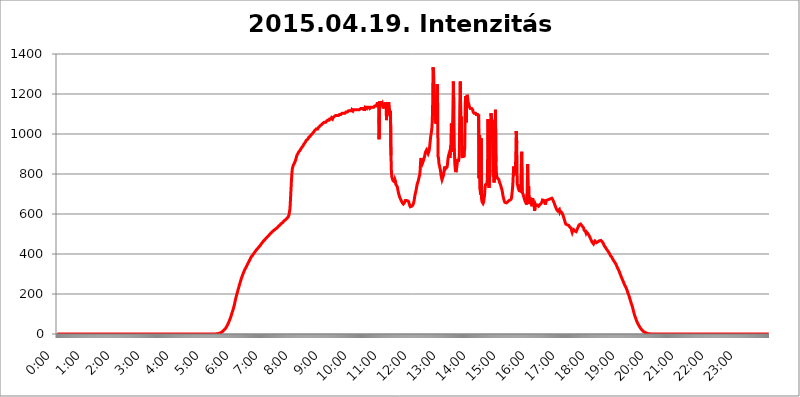
| Category | 2015.04.19. Intenzitás [W/m^2] |
|---|---|
| 0.0 | -0.256 |
| 0.0006944444444444445 | -0.256 |
| 0.001388888888888889 | -0.256 |
| 0.0020833333333333333 | -0.256 |
| 0.002777777777777778 | -0.256 |
| 0.003472222222222222 | -0.256 |
| 0.004166666666666667 | -0.256 |
| 0.004861111111111111 | -0.256 |
| 0.005555555555555556 | -0.256 |
| 0.0062499999999999995 | -0.256 |
| 0.006944444444444444 | -0.256 |
| 0.007638888888888889 | -0.256 |
| 0.008333333333333333 | -0.256 |
| 0.009027777777777779 | -0.256 |
| 0.009722222222222222 | -0.256 |
| 0.010416666666666666 | -0.256 |
| 0.011111111111111112 | -0.256 |
| 0.011805555555555555 | -0.256 |
| 0.012499999999999999 | -0.256 |
| 0.013194444444444444 | -0.256 |
| 0.013888888888888888 | -0.256 |
| 0.014583333333333332 | -0.256 |
| 0.015277777777777777 | -0.256 |
| 0.015972222222222224 | -0.256 |
| 0.016666666666666666 | -0.256 |
| 0.017361111111111112 | -0.256 |
| 0.018055555555555557 | -0.256 |
| 0.01875 | -0.256 |
| 0.019444444444444445 | -0.256 |
| 0.02013888888888889 | -0.256 |
| 0.020833333333333332 | -0.256 |
| 0.02152777777777778 | -0.256 |
| 0.022222222222222223 | -0.256 |
| 0.02291666666666667 | -0.256 |
| 0.02361111111111111 | -0.256 |
| 0.024305555555555556 | -0.256 |
| 0.024999999999999998 | -0.256 |
| 0.025694444444444447 | -0.256 |
| 0.02638888888888889 | -0.256 |
| 0.027083333333333334 | -0.256 |
| 0.027777777777777776 | -0.256 |
| 0.02847222222222222 | -0.256 |
| 0.029166666666666664 | -0.256 |
| 0.029861111111111113 | -0.256 |
| 0.030555555555555555 | -0.256 |
| 0.03125 | -0.256 |
| 0.03194444444444445 | -0.256 |
| 0.03263888888888889 | -0.256 |
| 0.03333333333333333 | -0.256 |
| 0.034027777777777775 | -0.256 |
| 0.034722222222222224 | -0.256 |
| 0.035416666666666666 | -0.256 |
| 0.036111111111111115 | -0.256 |
| 0.03680555555555556 | -0.256 |
| 0.0375 | -0.256 |
| 0.03819444444444444 | -0.256 |
| 0.03888888888888889 | -0.256 |
| 0.03958333333333333 | -0.256 |
| 0.04027777777777778 | -0.256 |
| 0.04097222222222222 | -0.256 |
| 0.041666666666666664 | -0.256 |
| 0.042361111111111106 | -0.256 |
| 0.04305555555555556 | -0.256 |
| 0.043750000000000004 | -0.256 |
| 0.044444444444444446 | -0.256 |
| 0.04513888888888889 | -0.256 |
| 0.04583333333333334 | -0.256 |
| 0.04652777777777778 | -0.256 |
| 0.04722222222222222 | -0.256 |
| 0.04791666666666666 | -0.256 |
| 0.04861111111111111 | -0.256 |
| 0.049305555555555554 | -0.256 |
| 0.049999999999999996 | -0.256 |
| 0.05069444444444445 | -0.256 |
| 0.051388888888888894 | -0.256 |
| 0.052083333333333336 | -0.256 |
| 0.05277777777777778 | -0.256 |
| 0.05347222222222222 | -0.256 |
| 0.05416666666666667 | -0.256 |
| 0.05486111111111111 | -0.256 |
| 0.05555555555555555 | -0.256 |
| 0.05625 | -0.256 |
| 0.05694444444444444 | -0.256 |
| 0.057638888888888885 | -0.256 |
| 0.05833333333333333 | -0.256 |
| 0.05902777777777778 | -0.256 |
| 0.059722222222222225 | -0.256 |
| 0.06041666666666667 | -0.256 |
| 0.061111111111111116 | -0.256 |
| 0.06180555555555556 | -0.256 |
| 0.0625 | -0.256 |
| 0.06319444444444444 | -0.256 |
| 0.06388888888888888 | -0.256 |
| 0.06458333333333334 | -0.256 |
| 0.06527777777777778 | -0.256 |
| 0.06597222222222222 | -0.256 |
| 0.06666666666666667 | -0.256 |
| 0.06736111111111111 | -0.256 |
| 0.06805555555555555 | -0.256 |
| 0.06874999999999999 | -0.256 |
| 0.06944444444444443 | -0.256 |
| 0.07013888888888889 | -0.256 |
| 0.07083333333333333 | -0.256 |
| 0.07152777777777779 | -0.256 |
| 0.07222222222222223 | -0.256 |
| 0.07291666666666667 | -0.256 |
| 0.07361111111111111 | -0.256 |
| 0.07430555555555556 | -0.256 |
| 0.075 | -0.256 |
| 0.07569444444444444 | -0.256 |
| 0.0763888888888889 | -0.256 |
| 0.07708333333333334 | -0.256 |
| 0.07777777777777778 | -0.256 |
| 0.07847222222222222 | -0.256 |
| 0.07916666666666666 | -0.256 |
| 0.0798611111111111 | -0.256 |
| 0.08055555555555556 | -0.256 |
| 0.08125 | -0.256 |
| 0.08194444444444444 | -0.256 |
| 0.08263888888888889 | -0.256 |
| 0.08333333333333333 | -0.256 |
| 0.08402777777777777 | -0.256 |
| 0.08472222222222221 | -0.256 |
| 0.08541666666666665 | -0.256 |
| 0.08611111111111112 | -0.256 |
| 0.08680555555555557 | -0.256 |
| 0.08750000000000001 | -0.256 |
| 0.08819444444444445 | -0.256 |
| 0.08888888888888889 | -0.256 |
| 0.08958333333333333 | -0.256 |
| 0.09027777777777778 | -0.256 |
| 0.09097222222222222 | -0.256 |
| 0.09166666666666667 | -0.256 |
| 0.09236111111111112 | -0.256 |
| 0.09305555555555556 | -0.256 |
| 0.09375 | -0.256 |
| 0.09444444444444444 | -0.256 |
| 0.09513888888888888 | -0.256 |
| 0.09583333333333333 | -0.256 |
| 0.09652777777777777 | -0.256 |
| 0.09722222222222222 | -0.256 |
| 0.09791666666666667 | -0.256 |
| 0.09861111111111111 | -0.256 |
| 0.09930555555555555 | -0.256 |
| 0.09999999999999999 | -0.256 |
| 0.10069444444444443 | -0.256 |
| 0.1013888888888889 | -0.256 |
| 0.10208333333333335 | -0.256 |
| 0.10277777777777779 | -0.256 |
| 0.10347222222222223 | -0.256 |
| 0.10416666666666667 | -0.256 |
| 0.10486111111111111 | -0.256 |
| 0.10555555555555556 | -0.256 |
| 0.10625 | -0.256 |
| 0.10694444444444444 | -0.256 |
| 0.1076388888888889 | -0.256 |
| 0.10833333333333334 | -0.256 |
| 0.10902777777777778 | -0.256 |
| 0.10972222222222222 | -0.256 |
| 0.1111111111111111 | -0.256 |
| 0.11180555555555556 | -0.256 |
| 0.11180555555555556 | -0.256 |
| 0.1125 | -0.256 |
| 0.11319444444444444 | -0.256 |
| 0.11388888888888889 | -0.256 |
| 0.11458333333333333 | -0.256 |
| 0.11527777777777777 | -0.256 |
| 0.11597222222222221 | -0.256 |
| 0.11666666666666665 | -0.256 |
| 0.1173611111111111 | -0.256 |
| 0.11805555555555557 | -0.256 |
| 0.11944444444444445 | -0.256 |
| 0.12013888888888889 | -0.256 |
| 0.12083333333333333 | -0.256 |
| 0.12152777777777778 | -0.256 |
| 0.12222222222222223 | -0.256 |
| 0.12291666666666667 | -0.256 |
| 0.12291666666666667 | -0.256 |
| 0.12361111111111112 | -0.256 |
| 0.12430555555555556 | -0.256 |
| 0.125 | -0.256 |
| 0.12569444444444444 | -0.256 |
| 0.12638888888888888 | -0.256 |
| 0.12708333333333333 | -0.256 |
| 0.16875 | -0.256 |
| 0.12847222222222224 | -0.256 |
| 0.12916666666666668 | -0.256 |
| 0.12986111111111112 | -0.256 |
| 0.13055555555555556 | -0.256 |
| 0.13125 | -0.256 |
| 0.13194444444444445 | -0.256 |
| 0.1326388888888889 | -0.256 |
| 0.13333333333333333 | -0.256 |
| 0.13402777777777777 | -0.256 |
| 0.13402777777777777 | -0.256 |
| 0.13472222222222222 | -0.256 |
| 0.13541666666666666 | -0.256 |
| 0.1361111111111111 | -0.256 |
| 0.13749999999999998 | -0.256 |
| 0.13819444444444443 | -0.256 |
| 0.1388888888888889 | -0.256 |
| 0.13958333333333334 | -0.256 |
| 0.14027777777777778 | -0.256 |
| 0.14097222222222222 | -0.256 |
| 0.14166666666666666 | -0.256 |
| 0.1423611111111111 | -0.256 |
| 0.14305555555555557 | -0.256 |
| 0.14375000000000002 | -0.256 |
| 0.14444444444444446 | -0.256 |
| 0.1451388888888889 | -0.256 |
| 0.1451388888888889 | -0.256 |
| 0.14652777777777778 | -0.256 |
| 0.14722222222222223 | -0.256 |
| 0.14791666666666667 | -0.256 |
| 0.1486111111111111 | -0.256 |
| 0.14930555555555555 | -0.256 |
| 0.15 | -0.256 |
| 0.15069444444444444 | -0.256 |
| 0.15138888888888888 | -0.256 |
| 0.15208333333333332 | -0.256 |
| 0.15277777777777776 | -0.256 |
| 0.15347222222222223 | -0.256 |
| 0.15416666666666667 | -0.256 |
| 0.15486111111111112 | -0.256 |
| 0.15555555555555556 | -0.256 |
| 0.15625 | -0.256 |
| 0.15694444444444444 | -0.256 |
| 0.15763888888888888 | -0.256 |
| 0.15833333333333333 | -0.256 |
| 0.15902777777777777 | -0.256 |
| 0.15972222222222224 | -0.256 |
| 0.16041666666666668 | -0.256 |
| 0.16111111111111112 | -0.256 |
| 0.16180555555555556 | -0.256 |
| 0.1625 | -0.256 |
| 0.16319444444444445 | -0.256 |
| 0.1638888888888889 | -0.256 |
| 0.16458333333333333 | -0.256 |
| 0.16527777777777777 | -0.256 |
| 0.16597222222222222 | -0.256 |
| 0.16666666666666666 | -0.256 |
| 0.1673611111111111 | -0.256 |
| 0.16805555555555554 | -0.256 |
| 0.16874999999999998 | -0.256 |
| 0.16944444444444443 | -0.256 |
| 0.17013888888888887 | -0.256 |
| 0.1708333333333333 | -0.256 |
| 0.17152777777777775 | -0.256 |
| 0.17222222222222225 | -0.256 |
| 0.1729166666666667 | -0.256 |
| 0.17361111111111113 | -0.256 |
| 0.17430555555555557 | -0.256 |
| 0.17500000000000002 | -0.256 |
| 0.17569444444444446 | -0.256 |
| 0.1763888888888889 | -0.256 |
| 0.17708333333333334 | -0.256 |
| 0.17777777777777778 | -0.256 |
| 0.17847222222222223 | -0.256 |
| 0.17916666666666667 | -0.256 |
| 0.1798611111111111 | -0.256 |
| 0.18055555555555555 | -0.256 |
| 0.18125 | -0.256 |
| 0.18194444444444444 | -0.256 |
| 0.1826388888888889 | -0.256 |
| 0.18333333333333335 | -0.256 |
| 0.1840277777777778 | -0.256 |
| 0.18472222222222223 | -0.256 |
| 0.18541666666666667 | -0.256 |
| 0.18611111111111112 | -0.256 |
| 0.18680555555555556 | -0.256 |
| 0.1875 | -0.256 |
| 0.18819444444444444 | -0.256 |
| 0.18888888888888888 | -0.256 |
| 0.18958333333333333 | -0.256 |
| 0.19027777777777777 | -0.256 |
| 0.1909722222222222 | -0.256 |
| 0.19166666666666665 | -0.256 |
| 0.19236111111111112 | -0.256 |
| 0.19305555555555554 | -0.256 |
| 0.19375 | -0.256 |
| 0.19444444444444445 | -0.256 |
| 0.1951388888888889 | -0.256 |
| 0.19583333333333333 | -0.256 |
| 0.19652777777777777 | -0.256 |
| 0.19722222222222222 | -0.256 |
| 0.19791666666666666 | -0.256 |
| 0.1986111111111111 | -0.256 |
| 0.19930555555555554 | -0.256 |
| 0.19999999999999998 | -0.256 |
| 0.20069444444444443 | -0.256 |
| 0.20138888888888887 | -0.256 |
| 0.2020833333333333 | -0.256 |
| 0.2027777777777778 | -0.256 |
| 0.2034722222222222 | -0.256 |
| 0.2041666666666667 | -0.256 |
| 0.20486111111111113 | -0.256 |
| 0.20555555555555557 | -0.256 |
| 0.20625000000000002 | -0.256 |
| 0.20694444444444446 | -0.256 |
| 0.2076388888888889 | -0.256 |
| 0.20833333333333334 | -0.256 |
| 0.20902777777777778 | -0.256 |
| 0.20972222222222223 | -0.256 |
| 0.21041666666666667 | -0.256 |
| 0.2111111111111111 | -0.256 |
| 0.21180555555555555 | -0.256 |
| 0.2125 | -0.256 |
| 0.21319444444444444 | -0.256 |
| 0.2138888888888889 | -0.256 |
| 0.21458333333333335 | -0.256 |
| 0.2152777777777778 | -0.256 |
| 0.21597222222222223 | -0.256 |
| 0.21666666666666667 | -0.256 |
| 0.21736111111111112 | -0.256 |
| 0.21805555555555556 | -0.256 |
| 0.21875 | -0.256 |
| 0.21944444444444444 | -0.256 |
| 0.22013888888888888 | -0.256 |
| 0.22083333333333333 | -0.256 |
| 0.22152777777777777 | -0.256 |
| 0.2222222222222222 | -0.256 |
| 0.22291666666666665 | 1.09 |
| 0.2236111111111111 | 1.09 |
| 0.22430555555555556 | 1.09 |
| 0.225 | 1.09 |
| 0.22569444444444445 | 2.439 |
| 0.2263888888888889 | 2.439 |
| 0.22708333333333333 | 3.791 |
| 0.22777777777777777 | 3.791 |
| 0.22847222222222222 | 5.146 |
| 0.22916666666666666 | 6.503 |
| 0.2298611111111111 | 7.862 |
| 0.23055555555555554 | 9.225 |
| 0.23124999999999998 | 10.589 |
| 0.23194444444444443 | 13.325 |
| 0.23263888888888887 | 14.696 |
| 0.2333333333333333 | 17.444 |
| 0.2340277777777778 | 20.201 |
| 0.2347222222222222 | 22.965 |
| 0.2354166666666667 | 25.736 |
| 0.23611111111111113 | 28.514 |
| 0.23680555555555557 | 32.691 |
| 0.23750000000000002 | 36.881 |
| 0.23819444444444446 | 41.081 |
| 0.2388888888888889 | 46.695 |
| 0.23958333333333334 | 50.914 |
| 0.24027777777777778 | 56.548 |
| 0.24097222222222223 | 62.189 |
| 0.24166666666666667 | 69.246 |
| 0.2423611111111111 | 74.892 |
| 0.24305555555555555 | 81.946 |
| 0.24375 | 88.991 |
| 0.24444444444444446 | 97.427 |
| 0.24513888888888888 | 105.834 |
| 0.24583333333333335 | 112.814 |
| 0.2465277777777778 | 121.152 |
| 0.24722222222222223 | 129.444 |
| 0.24791666666666667 | 139.051 |
| 0.24861111111111112 | 148.579 |
| 0.24930555555555556 | 160.704 |
| 0.25 | 172.676 |
| 0.25069444444444444 | 183.184 |
| 0.2513888888888889 | 192.271 |
| 0.2520833333333333 | 201.258 |
| 0.25277777777777777 | 210.144 |
| 0.2534722222222222 | 220.177 |
| 0.25416666666666665 | 227.618 |
| 0.2548611111111111 | 237.433 |
| 0.2555555555555556 | 245.925 |
| 0.25625000000000003 | 254.333 |
| 0.2569444444444445 | 262.666 |
| 0.2576388888888889 | 270.931 |
| 0.25833333333333336 | 279.136 |
| 0.2590277777777778 | 286.13 |
| 0.25972222222222224 | 293.096 |
| 0.2604166666666667 | 298.885 |
| 0.2611111111111111 | 305.819 |
| 0.26180555555555557 | 311.594 |
| 0.2625 | 317.371 |
| 0.26319444444444445 | 323.156 |
| 0.2638888888888889 | 326.633 |
| 0.26458333333333334 | 332.443 |
| 0.2652777777777778 | 337.109 |
| 0.2659722222222222 | 341.794 |
| 0.26666666666666666 | 347.682 |
| 0.2673611111111111 | 352.423 |
| 0.26805555555555555 | 357.196 |
| 0.26875 | 362.004 |
| 0.26944444444444443 | 366.851 |
| 0.2701388888888889 | 371.742 |
| 0.2708333333333333 | 376.682 |
| 0.27152777777777776 | 381.674 |
| 0.2722222222222222 | 386.723 |
| 0.27291666666666664 | 389.27 |
| 0.2736111111111111 | 391.834 |
| 0.2743055555555555 | 395.711 |
| 0.27499999999999997 | 399.628 |
| 0.27569444444444446 | 403.587 |
| 0.27638888888888885 | 406.25 |
| 0.27708333333333335 | 410.283 |
| 0.2777777777777778 | 412.998 |
| 0.27847222222222223 | 415.735 |
| 0.2791666666666667 | 419.883 |
| 0.2798611111111111 | 422.678 |
| 0.28055555555555556 | 425.497 |
| 0.28125 | 428.341 |
| 0.28194444444444444 | 431.211 |
| 0.2826388888888889 | 434.107 |
| 0.2833333333333333 | 437.031 |
| 0.28402777777777777 | 439.982 |
| 0.2847222222222222 | 442.962 |
| 0.28541666666666665 | 445.971 |
| 0.28611111111111115 | 450.542 |
| 0.28680555555555554 | 453.629 |
| 0.28750000000000003 | 456.747 |
| 0.2881944444444445 | 459.898 |
| 0.2888888888888889 | 463.083 |
| 0.28958333333333336 | 464.688 |
| 0.2902777777777778 | 467.925 |
| 0.29097222222222224 | 471.198 |
| 0.2916666666666667 | 472.848 |
| 0.2923611111111111 | 476.176 |
| 0.29305555555555557 | 479.541 |
| 0.29375 | 482.945 |
| 0.29444444444444445 | 484.662 |
| 0.2951388888888889 | 486.389 |
| 0.29583333333333334 | 489.873 |
| 0.2965277777777778 | 493.398 |
| 0.2972222222222222 | 495.176 |
| 0.29791666666666666 | 498.764 |
| 0.2986111111111111 | 500.575 |
| 0.29930555555555555 | 502.396 |
| 0.3 | 504.229 |
| 0.30069444444444443 | 507.927 |
| 0.3013888888888889 | 509.793 |
| 0.3020833333333333 | 511.671 |
| 0.30277777777777776 | 515.462 |
| 0.3034722222222222 | 515.462 |
| 0.30416666666666664 | 519.3 |
| 0.3048611111111111 | 521.237 |
| 0.3055555555555555 | 523.186 |
| 0.30624999999999997 | 525.148 |
| 0.3069444444444444 | 527.122 |
| 0.3076388888888889 | 529.108 |
| 0.30833333333333335 | 531.108 |
| 0.3090277777777778 | 533.12 |
| 0.30972222222222223 | 537.182 |
| 0.3104166666666667 | 539.234 |
| 0.3111111111111111 | 541.298 |
| 0.31180555555555556 | 543.376 |
| 0.3125 | 545.467 |
| 0.31319444444444444 | 547.572 |
| 0.3138888888888889 | 551.823 |
| 0.3145833333333333 | 553.97 |
| 0.31527777777777777 | 556.131 |
| 0.3159722222222222 | 556.131 |
| 0.31666666666666665 | 560.495 |
| 0.31736111111111115 | 562.699 |
| 0.31805555555555554 | 564.917 |
| 0.31875000000000003 | 567.15 |
| 0.3194444444444445 | 569.398 |
| 0.3201388888888889 | 571.661 |
| 0.32083333333333336 | 573.939 |
| 0.3215277777777778 | 576.233 |
| 0.32222222222222224 | 578.542 |
| 0.3229166666666667 | 580.866 |
| 0.3236111111111111 | 583.206 |
| 0.32430555555555557 | 587.934 |
| 0.325 | 595.145 |
| 0.32569444444444445 | 600.035 |
| 0.3263888888888889 | 625.508 |
| 0.32708333333333334 | 670.078 |
| 0.3277777777777778 | 719.855 |
| 0.3284722222222222 | 768.162 |
| 0.32916666666666666 | 805.632 |
| 0.3298611111111111 | 829.377 |
| 0.33055555555555555 | 837.51 |
| 0.33125 | 845.755 |
| 0.33194444444444443 | 849.92 |
| 0.3326388888888889 | 854.113 |
| 0.3333333333333333 | 858.335 |
| 0.3340277777777778 | 866.865 |
| 0.3347222222222222 | 875.511 |
| 0.3354166666666667 | 884.274 |
| 0.3361111111111111 | 893.157 |
| 0.3368055555555556 | 893.157 |
| 0.33749999999999997 | 902.16 |
| 0.33819444444444446 | 906.707 |
| 0.33888888888888885 | 911.285 |
| 0.33958333333333335 | 911.285 |
| 0.34027777777777773 | 915.893 |
| 0.34097222222222223 | 920.533 |
| 0.3416666666666666 | 925.203 |
| 0.3423611111111111 | 929.905 |
| 0.3430555555555555 | 934.639 |
| 0.34375 | 934.639 |
| 0.3444444444444445 | 939.404 |
| 0.3451388888888889 | 944.201 |
| 0.3458333333333334 | 949.03 |
| 0.34652777777777777 | 953.892 |
| 0.34722222222222227 | 953.892 |
| 0.34791666666666665 | 958.785 |
| 0.34861111111111115 | 963.712 |
| 0.34930555555555554 | 968.671 |
| 0.35000000000000003 | 968.671 |
| 0.3506944444444444 | 973.663 |
| 0.3513888888888889 | 973.663 |
| 0.3520833333333333 | 978.688 |
| 0.3527777777777778 | 983.747 |
| 0.3534722222222222 | 983.747 |
| 0.3541666666666667 | 983.747 |
| 0.3548611111111111 | 988.839 |
| 0.35555555555555557 | 993.965 |
| 0.35625 | 993.965 |
| 0.35694444444444445 | 999.125 |
| 0.3576388888888889 | 999.125 |
| 0.35833333333333334 | 1004.318 |
| 0.3590277777777778 | 1004.318 |
| 0.3597222222222222 | 1009.546 |
| 0.36041666666666666 | 1014.809 |
| 0.3611111111111111 | 1014.809 |
| 0.36180555555555555 | 1020.106 |
| 0.3625 | 1020.106 |
| 0.36319444444444443 | 1025.437 |
| 0.3638888888888889 | 1025.437 |
| 0.3645833333333333 | 1025.437 |
| 0.3652777777777778 | 1025.437 |
| 0.3659722222222222 | 1030.804 |
| 0.3666666666666667 | 1030.804 |
| 0.3673611111111111 | 1036.206 |
| 0.3680555555555556 | 1036.206 |
| 0.36874999999999997 | 1041.644 |
| 0.36944444444444446 | 1041.644 |
| 0.37013888888888885 | 1041.644 |
| 0.37083333333333335 | 1047.117 |
| 0.37152777777777773 | 1047.117 |
| 0.37222222222222223 | 1052.625 |
| 0.3729166666666666 | 1052.625 |
| 0.3736111111111111 | 1052.625 |
| 0.3743055555555555 | 1058.17 |
| 0.375 | 1058.17 |
| 0.3756944444444445 | 1058.17 |
| 0.3763888888888889 | 1058.17 |
| 0.3770833333333334 | 1058.17 |
| 0.37777777777777777 | 1063.751 |
| 0.37847222222222227 | 1063.751 |
| 0.37916666666666665 | 1069.368 |
| 0.37986111111111115 | 1069.368 |
| 0.38055555555555554 | 1069.368 |
| 0.38125000000000003 | 1069.368 |
| 0.3819444444444444 | 1075.021 |
| 0.3826388888888889 | 1075.021 |
| 0.3833333333333333 | 1075.021 |
| 0.3840277777777778 | 1075.021 |
| 0.3847222222222222 | 1080.711 |
| 0.3854166666666667 | 1080.711 |
| 0.3861111111111111 | 1075.021 |
| 0.38680555555555557 | 1080.711 |
| 0.3875 | 1080.711 |
| 0.38819444444444445 | 1086.439 |
| 0.3888888888888889 | 1086.439 |
| 0.38958333333333334 | 1086.439 |
| 0.3902777777777778 | 1092.203 |
| 0.3909722222222222 | 1092.203 |
| 0.39166666666666666 | 1092.203 |
| 0.3923611111111111 | 1092.203 |
| 0.39305555555555555 | 1092.203 |
| 0.39375 | 1092.203 |
| 0.39444444444444443 | 1092.203 |
| 0.3951388888888889 | 1092.203 |
| 0.3958333333333333 | 1098.004 |
| 0.3965277777777778 | 1098.004 |
| 0.3972222222222222 | 1098.004 |
| 0.3979166666666667 | 1098.004 |
| 0.3986111111111111 | 1098.004 |
| 0.3993055555555556 | 1103.843 |
| 0.39999999999999997 | 1103.843 |
| 0.40069444444444446 | 1103.843 |
| 0.40138888888888885 | 1103.843 |
| 0.40208333333333335 | 1103.843 |
| 0.40277777777777773 | 1103.843 |
| 0.40347222222222223 | 1103.843 |
| 0.4041666666666666 | 1103.843 |
| 0.4048611111111111 | 1109.72 |
| 0.4055555555555555 | 1109.72 |
| 0.40625 | 1109.72 |
| 0.4069444444444445 | 1109.72 |
| 0.4076388888888889 | 1109.72 |
| 0.4083333333333334 | 1115.634 |
| 0.40902777777777777 | 1115.634 |
| 0.40972222222222227 | 1115.634 |
| 0.41041666666666665 | 1115.634 |
| 0.41111111111111115 | 1115.634 |
| 0.41180555555555554 | 1115.634 |
| 0.41250000000000003 | 1115.634 |
| 0.4131944444444444 | 1121.587 |
| 0.4138888888888889 | 1121.587 |
| 0.4145833333333333 | 1115.634 |
| 0.4152777777777778 | 1121.587 |
| 0.4159722222222222 | 1121.587 |
| 0.4166666666666667 | 1121.587 |
| 0.4173611111111111 | 1121.587 |
| 0.41805555555555557 | 1121.587 |
| 0.41875 | 1121.587 |
| 0.41944444444444445 | 1121.587 |
| 0.4201388888888889 | 1121.587 |
| 0.42083333333333334 | 1121.587 |
| 0.4215277777777778 | 1121.587 |
| 0.4222222222222222 | 1121.587 |
| 0.42291666666666666 | 1121.587 |
| 0.4236111111111111 | 1121.587 |
| 0.42430555555555555 | 1121.587 |
| 0.425 | 1121.587 |
| 0.42569444444444443 | 1127.578 |
| 0.4263888888888889 | 1127.578 |
| 0.4270833333333333 | 1127.578 |
| 0.4277777777777778 | 1127.578 |
| 0.4284722222222222 | 1127.578 |
| 0.4291666666666667 | 1127.578 |
| 0.4298611111111111 | 1127.578 |
| 0.4305555555555556 | 1115.634 |
| 0.43124999999999997 | 1127.578 |
| 0.43194444444444446 | 1133.607 |
| 0.43263888888888885 | 1133.607 |
| 0.43333333333333335 | 1133.607 |
| 0.43402777777777773 | 1127.578 |
| 0.43472222222222223 | 1133.607 |
| 0.4354166666666666 | 1133.607 |
| 0.4361111111111111 | 1133.607 |
| 0.4368055555555555 | 1133.607 |
| 0.4375 | 1133.607 |
| 0.4381944444444445 | 1127.578 |
| 0.4388888888888889 | 1127.578 |
| 0.4395833333333334 | 1133.607 |
| 0.44027777777777777 | 1133.607 |
| 0.44097222222222227 | 1133.607 |
| 0.44166666666666665 | 1133.607 |
| 0.44236111111111115 | 1133.607 |
| 0.44305555555555554 | 1133.607 |
| 0.44375000000000003 | 1133.607 |
| 0.4444444444444444 | 1133.607 |
| 0.4451388888888889 | 1139.675 |
| 0.4458333333333333 | 1139.675 |
| 0.4465277777777778 | 1139.675 |
| 0.4472222222222222 | 1139.675 |
| 0.4479166666666667 | 1145.782 |
| 0.4486111111111111 | 1151.928 |
| 0.44930555555555557 | 1151.928 |
| 0.45 | 1151.928 |
| 0.45069444444444445 | 1151.928 |
| 0.4513888888888889 | 973.663 |
| 0.45208333333333334 | 1158.113 |
| 0.4527777777777778 | 1158.113 |
| 0.4534722222222222 | 1158.113 |
| 0.45416666666666666 | 1158.113 |
| 0.4548611111111111 | 1151.928 |
| 0.45555555555555555 | 1145.782 |
| 0.45625 | 1151.928 |
| 0.45694444444444443 | 1151.928 |
| 0.4576388888888889 | 1151.928 |
| 0.4583333333333333 | 1127.578 |
| 0.4590277777777778 | 1151.928 |
| 0.4597222222222222 | 1139.675 |
| 0.4604166666666667 | 1158.113 |
| 0.4611111111111111 | 1151.928 |
| 0.4618055555555556 | 1069.368 |
| 0.46249999999999997 | 1139.675 |
| 0.46319444444444446 | 1151.928 |
| 0.46388888888888885 | 1151.928 |
| 0.46458333333333335 | 1151.928 |
| 0.46527777777777773 | 1151.928 |
| 0.46597222222222223 | 1151.928 |
| 0.4666666666666666 | 1092.203 |
| 0.4673611111111111 | 1115.634 |
| 0.4680555555555555 | 893.157 |
| 0.46875 | 801.768 |
| 0.4694444444444445 | 782.842 |
| 0.4701388888888889 | 775.451 |
| 0.4708333333333334 | 768.162 |
| 0.47152777777777777 | 764.555 |
| 0.47222222222222227 | 764.555 |
| 0.47291666666666665 | 760.972 |
| 0.47361111111111115 | 771.794 |
| 0.47430555555555554 | 764.555 |
| 0.47500000000000003 | 746.886 |
| 0.4756944444444444 | 743.425 |
| 0.4763888888888889 | 739.988 |
| 0.4770833333333333 | 733.184 |
| 0.4777777777777778 | 719.855 |
| 0.4784722222222222 | 706.89 |
| 0.4791666666666667 | 697.399 |
| 0.4798611111111111 | 688.102 |
| 0.48055555555555557 | 682.011 |
| 0.48125 | 676.003 |
| 0.48194444444444445 | 670.078 |
| 0.4826388888888889 | 667.146 |
| 0.48333333333333334 | 661.343 |
| 0.4840277777777778 | 655.618 |
| 0.4847222222222222 | 652.786 |
| 0.48541666666666666 | 649.973 |
| 0.4861111111111111 | 649.973 |
| 0.48680555555555555 | 655.618 |
| 0.4875 | 661.343 |
| 0.48819444444444443 | 667.146 |
| 0.4888888888888889 | 670.078 |
| 0.4895833333333333 | 667.146 |
| 0.4902777777777778 | 667.146 |
| 0.4909722222222222 | 667.146 |
| 0.4916666666666667 | 667.146 |
| 0.4923611111111111 | 664.234 |
| 0.4930555555555556 | 658.471 |
| 0.49374999999999997 | 649.973 |
| 0.49444444444444446 | 641.649 |
| 0.49513888888888885 | 636.194 |
| 0.49583333333333335 | 636.194 |
| 0.49652777777777773 | 636.194 |
| 0.49722222222222223 | 638.912 |
| 0.4979166666666666 | 641.649 |
| 0.4986111111111111 | 644.405 |
| 0.4993055555555555 | 649.973 |
| 0.5 | 658.471 |
| 0.5006944444444444 | 670.078 |
| 0.5013888888888889 | 688.102 |
| 0.5020833333333333 | 700.54 |
| 0.5027777777777778 | 710.098 |
| 0.5034722222222222 | 723.153 |
| 0.5041666666666667 | 736.574 |
| 0.5048611111111111 | 750.371 |
| 0.5055555555555555 | 757.414 |
| 0.50625 | 764.555 |
| 0.5069444444444444 | 775.451 |
| 0.5076388888888889 | 786.575 |
| 0.5083333333333333 | 794.119 |
| 0.5090277777777777 | 821.353 |
| 0.5097222222222222 | 866.865 |
| 0.5104166666666666 | 879.878 |
| 0.5111111111111112 | 858.335 |
| 0.5118055555555555 | 849.92 |
| 0.5125000000000001 | 854.113 |
| 0.5131944444444444 | 862.585 |
| 0.513888888888889 | 871.173 |
| 0.5145833333333333 | 879.878 |
| 0.5152777777777778 | 888.701 |
| 0.5159722222222222 | 902.16 |
| 0.5166666666666667 | 911.285 |
| 0.517361111111111 | 915.893 |
| 0.5180555555555556 | 920.533 |
| 0.5187499999999999 | 915.893 |
| 0.5194444444444445 | 925.203 |
| 0.5201388888888888 | 902.16 |
| 0.5208333333333334 | 906.707 |
| 0.5215277777777778 | 915.893 |
| 0.5222222222222223 | 934.639 |
| 0.5229166666666667 | 958.785 |
| 0.5236111111111111 | 983.747 |
| 0.5243055555555556 | 999.125 |
| 0.525 | 1014.809 |
| 0.5256944444444445 | 1041.644 |
| 0.5263888888888889 | 1115.634 |
| 0.5270833333333333 | 1333.352 |
| 0.5277777777777778 | 1311.658 |
| 0.5284722222222222 | 1228.794 |
| 0.5291666666666667 | 1139.675 |
| 0.5298611111111111 | 1069.368 |
| 0.5305555555555556 | 1080.711 |
| 0.53125 | 1052.625 |
| 0.5319444444444444 | 1158.113 |
| 0.5326388888888889 | 1248.934 |
| 0.5333333333333333 | 1235.465 |
| 0.5340277777777778 | 888.701 |
| 0.5347222222222222 | 879.878 |
| 0.5354166666666667 | 849.92 |
| 0.5361111111111111 | 841.619 |
| 0.5368055555555555 | 829.377 |
| 0.5375 | 817.382 |
| 0.5381944444444444 | 794.119 |
| 0.5388888888888889 | 782.842 |
| 0.5395833333333333 | 771.794 |
| 0.5402777777777777 | 771.794 |
| 0.5409722222222222 | 775.451 |
| 0.5416666666666666 | 794.119 |
| 0.5423611111111112 | 809.522 |
| 0.5430555555555555 | 829.377 |
| 0.5437500000000001 | 837.51 |
| 0.5444444444444444 | 825.351 |
| 0.545138888888889 | 821.353 |
| 0.5458333333333333 | 825.351 |
| 0.5465277777777778 | 833.43 |
| 0.5472222222222222 | 845.755 |
| 0.5479166666666667 | 871.173 |
| 0.548611111111111 | 888.701 |
| 0.5493055555555556 | 897.643 |
| 0.5499999999999999 | 902.16 |
| 0.5506944444444445 | 879.878 |
| 0.5513888888888888 | 875.511 |
| 0.5520833333333334 | 944.201 |
| 0.5527777777777778 | 1052.625 |
| 0.5534722222222223 | 911.285 |
| 0.5541666666666667 | 978.688 |
| 0.5548611111111111 | 1103.843 |
| 0.5555555555555556 | 1262.571 |
| 0.55625 | 1121.587 |
| 0.5569444444444445 | 920.533 |
| 0.5576388888888889 | 849.92 |
| 0.5583333333333333 | 821.353 |
| 0.5590277777777778 | 809.522 |
| 0.5597222222222222 | 817.382 |
| 0.5604166666666667 | 837.51 |
| 0.5611111111111111 | 841.619 |
| 0.5618055555555556 | 875.511 |
| 0.5625 | 862.585 |
| 0.5631944444444444 | 871.173 |
| 0.5638888888888889 | 888.701 |
| 0.5645833333333333 | 1139.675 |
| 0.5652777777777778 | 1262.571 |
| 0.5659722222222222 | 1063.751 |
| 0.5666666666666667 | 1086.439 |
| 0.5673611111111111 | 958.785 |
| 0.5680555555555555 | 888.701 |
| 0.56875 | 879.878 |
| 0.5694444444444444 | 939.404 |
| 0.5701388888888889 | 884.274 |
| 0.5708333333333333 | 915.893 |
| 0.5715277777777777 | 925.203 |
| 0.5722222222222222 | 1151.928 |
| 0.5729166666666666 | 1189.633 |
| 0.5736111111111112 | 1058.17 |
| 0.5743055555555555 | 1164.337 |
| 0.5750000000000001 | 1196.058 |
| 0.5756944444444444 | 1176.905 |
| 0.576388888888889 | 1158.113 |
| 0.5770833333333333 | 1151.928 |
| 0.5777777777777778 | 1139.675 |
| 0.5784722222222222 | 1133.607 |
| 0.5791666666666667 | 1127.578 |
| 0.579861111111111 | 1127.578 |
| 0.5805555555555556 | 1127.578 |
| 0.5812499999999999 | 1127.578 |
| 0.5819444444444445 | 1127.578 |
| 0.5826388888888888 | 1121.587 |
| 0.5833333333333334 | 1109.72 |
| 0.5840277777777778 | 1109.72 |
| 0.5847222222222223 | 1103.843 |
| 0.5854166666666667 | 1103.843 |
| 0.5861111111111111 | 1103.843 |
| 0.5868055555555556 | 1103.843 |
| 0.5875 | 1098.004 |
| 0.5881944444444445 | 1098.004 |
| 0.5888888888888889 | 1098.004 |
| 0.5895833333333333 | 1098.004 |
| 0.5902777777777778 | 1092.203 |
| 0.5909722222222222 | 1098.004 |
| 0.5916666666666667 | 779.134 |
| 0.5923611111111111 | 993.965 |
| 0.5930555555555556 | 723.153 |
| 0.59375 | 697.399 |
| 0.5944444444444444 | 978.688 |
| 0.5951388888888889 | 676.003 |
| 0.5958333333333333 | 661.343 |
| 0.5965277777777778 | 658.471 |
| 0.5972222222222222 | 652.786 |
| 0.5979166666666667 | 658.471 |
| 0.5986111111111111 | 676.003 |
| 0.5993055555555555 | 694.278 |
| 0.6 | 733.184 |
| 0.6006944444444444 | 746.886 |
| 0.6013888888888889 | 743.425 |
| 0.6020833333333333 | 743.425 |
| 0.6027777777777777 | 750.371 |
| 0.6034722222222222 | 817.382 |
| 0.6041666666666666 | 1075.021 |
| 0.6048611111111112 | 841.619 |
| 0.6055555555555555 | 729.817 |
| 0.6062500000000001 | 733.184 |
| 0.6069444444444444 | 821.353 |
| 0.607638888888889 | 973.663 |
| 0.6083333333333333 | 1103.843 |
| 0.6090277777777778 | 1103.843 |
| 0.6097222222222222 | 1103.843 |
| 0.6104166666666667 | 1041.644 |
| 0.611111111111111 | 1069.368 |
| 0.6118055555555556 | 794.119 |
| 0.6124999999999999 | 757.414 |
| 0.6131944444444445 | 775.451 |
| 0.6138888888888888 | 805.632 |
| 0.6145833333333334 | 1121.587 |
| 0.6152777777777778 | 862.585 |
| 0.6159722222222223 | 801.768 |
| 0.6166666666666667 | 786.575 |
| 0.6173611111111111 | 779.134 |
| 0.6180555555555556 | 775.451 |
| 0.61875 | 775.451 |
| 0.6194444444444445 | 771.794 |
| 0.6201388888888889 | 760.972 |
| 0.6208333333333333 | 753.881 |
| 0.6215277777777778 | 750.371 |
| 0.6222222222222222 | 739.988 |
| 0.6229166666666667 | 729.817 |
| 0.6236111111111111 | 723.153 |
| 0.6243055555555556 | 710.098 |
| 0.625 | 694.278 |
| 0.6256944444444444 | 682.011 |
| 0.6263888888888889 | 673.03 |
| 0.6270833333333333 | 664.234 |
| 0.6277777777777778 | 658.471 |
| 0.6284722222222222 | 655.618 |
| 0.6291666666666667 | 655.618 |
| 0.6298611111111111 | 655.618 |
| 0.6305555555555555 | 655.618 |
| 0.63125 | 658.471 |
| 0.6319444444444444 | 661.343 |
| 0.6326388888888889 | 664.234 |
| 0.6333333333333333 | 667.146 |
| 0.6340277777777777 | 670.078 |
| 0.6347222222222222 | 670.078 |
| 0.6354166666666666 | 670.078 |
| 0.6361111111111112 | 670.078 |
| 0.6368055555555555 | 676.003 |
| 0.6375000000000001 | 691.18 |
| 0.6381944444444444 | 716.58 |
| 0.638888888888889 | 743.425 |
| 0.6395833333333333 | 797.931 |
| 0.6402777777777778 | 837.51 |
| 0.6409722222222222 | 794.119 |
| 0.6416666666666667 | 809.522 |
| 0.642361111111111 | 817.382 |
| 0.6430555555555556 | 875.511 |
| 0.6437499999999999 | 1014.809 |
| 0.6444444444444445 | 953.892 |
| 0.6451388888888888 | 750.371 |
| 0.6458333333333334 | 743.425 |
| 0.6465277777777778 | 729.817 |
| 0.6472222222222223 | 723.153 |
| 0.6479166666666667 | 716.58 |
| 0.6486111111111111 | 713.328 |
| 0.6493055555555556 | 713.328 |
| 0.65 | 713.328 |
| 0.6506944444444445 | 716.58 |
| 0.6513888888888889 | 911.285 |
| 0.6520833333333333 | 713.328 |
| 0.6527777777777778 | 703.704 |
| 0.6534722222222222 | 697.399 |
| 0.6541666666666667 | 688.102 |
| 0.6548611111111111 | 678.997 |
| 0.6555555555555556 | 670.078 |
| 0.65625 | 664.234 |
| 0.6569444444444444 | 658.471 |
| 0.6576388888888889 | 655.618 |
| 0.6583333333333333 | 647.179 |
| 0.6590277777777778 | 700.54 |
| 0.6597222222222222 | 849.92 |
| 0.6604166666666667 | 697.399 |
| 0.6611111111111111 | 739.988 |
| 0.6618055555555555 | 649.973 |
| 0.6625 | 652.786 |
| 0.6631944444444444 | 661.343 |
| 0.6638888888888889 | 682.011 |
| 0.6645833333333333 | 667.146 |
| 0.6652777777777777 | 647.179 |
| 0.6659722222222222 | 638.912 |
| 0.6666666666666666 | 678.997 |
| 0.6673611111111111 | 670.078 |
| 0.6680555555555556 | 658.471 |
| 0.6687500000000001 | 652.786 |
| 0.6694444444444444 | 615.11 |
| 0.6701388888888888 | 633.495 |
| 0.6708333333333334 | 647.179 |
| 0.6715277777777778 | 641.649 |
| 0.6722222222222222 | 641.649 |
| 0.6729166666666666 | 641.649 |
| 0.6736111111111112 | 644.405 |
| 0.6743055555555556 | 641.649 |
| 0.6749999999999999 | 638.912 |
| 0.6756944444444444 | 641.649 |
| 0.6763888888888889 | 644.405 |
| 0.6770833333333334 | 644.405 |
| 0.6777777777777777 | 649.973 |
| 0.6784722222222223 | 652.786 |
| 0.6791666666666667 | 655.618 |
| 0.6798611111111111 | 661.343 |
| 0.6805555555555555 | 670.078 |
| 0.68125 | 673.03 |
| 0.6819444444444445 | 670.078 |
| 0.6826388888888889 | 667.146 |
| 0.6833333333333332 | 667.146 |
| 0.6840277777777778 | 670.078 |
| 0.6847222222222222 | 647.179 |
| 0.6854166666666667 | 667.146 |
| 0.686111111111111 | 667.146 |
| 0.6868055555555556 | 667.146 |
| 0.6875 | 670.078 |
| 0.6881944444444444 | 673.03 |
| 0.688888888888889 | 673.03 |
| 0.6895833333333333 | 673.03 |
| 0.6902777777777778 | 676.003 |
| 0.6909722222222222 | 676.003 |
| 0.6916666666666668 | 676.003 |
| 0.6923611111111111 | 676.003 |
| 0.6930555555555555 | 678.997 |
| 0.69375 | 678.997 |
| 0.6944444444444445 | 678.997 |
| 0.6951388888888889 | 670.078 |
| 0.6958333333333333 | 664.234 |
| 0.6965277777777777 | 658.471 |
| 0.6972222222222223 | 652.786 |
| 0.6979166666666666 | 644.405 |
| 0.6986111111111111 | 638.912 |
| 0.6993055555555556 | 633.495 |
| 0.7000000000000001 | 625.508 |
| 0.7006944444444444 | 620.273 |
| 0.7013888888888888 | 617.682 |
| 0.7020833333333334 | 615.11 |
| 0.7027777777777778 | 615.11 |
| 0.7034722222222222 | 615.11 |
| 0.7041666666666666 | 622.881 |
| 0.7048611111111112 | 610.016 |
| 0.7055555555555556 | 615.11 |
| 0.7062499999999999 | 612.554 |
| 0.7069444444444444 | 610.016 |
| 0.7076388888888889 | 607.495 |
| 0.7083333333333334 | 602.505 |
| 0.7090277777777777 | 597.582 |
| 0.7097222222222223 | 590.321 |
| 0.7104166666666667 | 580.866 |
| 0.7111111111111111 | 573.939 |
| 0.7118055555555555 | 564.917 |
| 0.7125 | 556.131 |
| 0.7131944444444445 | 549.691 |
| 0.7138888888888889 | 545.467 |
| 0.7145833333333332 | 545.467 |
| 0.7152777777777778 | 545.467 |
| 0.7159722222222222 | 543.376 |
| 0.7166666666666667 | 543.376 |
| 0.717361111111111 | 543.376 |
| 0.7180555555555556 | 539.234 |
| 0.71875 | 535.145 |
| 0.7194444444444444 | 531.108 |
| 0.720138888888889 | 533.12 |
| 0.7208333333333333 | 529.108 |
| 0.7215277777777778 | 515.462 |
| 0.7222222222222222 | 507.927 |
| 0.7229166666666668 | 515.462 |
| 0.7236111111111111 | 519.3 |
| 0.7243055555555555 | 521.237 |
| 0.725 | 519.3 |
| 0.7256944444444445 | 515.462 |
| 0.7263888888888889 | 513.561 |
| 0.7270833333333333 | 511.671 |
| 0.7277777777777777 | 511.671 |
| 0.7284722222222223 | 517.375 |
| 0.7291666666666666 | 523.186 |
| 0.7298611111111111 | 527.122 |
| 0.7305555555555556 | 535.145 |
| 0.7312500000000001 | 539.234 |
| 0.7319444444444444 | 545.467 |
| 0.7326388888888888 | 549.691 |
| 0.7333333333333334 | 549.691 |
| 0.7340277777777778 | 549.691 |
| 0.7347222222222222 | 547.572 |
| 0.7354166666666666 | 543.376 |
| 0.7361111111111112 | 541.298 |
| 0.7368055555555556 | 537.182 |
| 0.7374999999999999 | 535.145 |
| 0.7381944444444444 | 531.108 |
| 0.7388888888888889 | 519.3 |
| 0.7395833333333334 | 521.237 |
| 0.7402777777777777 | 517.375 |
| 0.7409722222222223 | 511.671 |
| 0.7416666666666667 | 504.229 |
| 0.7423611111111111 | 509.793 |
| 0.7430555555555555 | 507.927 |
| 0.74375 | 504.229 |
| 0.7444444444444445 | 500.575 |
| 0.7451388888888889 | 496.965 |
| 0.7458333333333332 | 493.398 |
| 0.7465277777777778 | 488.126 |
| 0.7472222222222222 | 482.945 |
| 0.7479166666666667 | 476.176 |
| 0.748611111111111 | 472.848 |
| 0.7493055555555556 | 466.302 |
| 0.75 | 459.898 |
| 0.7506944444444444 | 455.184 |
| 0.751388888888889 | 455.184 |
| 0.7520833333333333 | 450.542 |
| 0.7527777777777778 | 456.747 |
| 0.7534722222222222 | 461.486 |
| 0.7541666666666668 | 464.688 |
| 0.7548611111111111 | 463.083 |
| 0.7555555555555555 | 459.898 |
| 0.75625 | 456.747 |
| 0.7569444444444445 | 458.318 |
| 0.7576388888888889 | 459.898 |
| 0.7583333333333333 | 461.486 |
| 0.7590277777777777 | 463.083 |
| 0.7597222222222223 | 464.688 |
| 0.7604166666666666 | 466.302 |
| 0.7611111111111111 | 469.557 |
| 0.7618055555555556 | 469.557 |
| 0.7625000000000001 | 467.925 |
| 0.7631944444444444 | 467.925 |
| 0.7638888888888888 | 464.688 |
| 0.7645833333333334 | 459.898 |
| 0.7652777777777778 | 455.184 |
| 0.7659722222222222 | 452.082 |
| 0.7666666666666666 | 447.487 |
| 0.7673611111111112 | 439.982 |
| 0.7680555555555556 | 438.503 |
| 0.7687499999999999 | 434.107 |
| 0.7694444444444444 | 429.773 |
| 0.7701388888888889 | 425.497 |
| 0.7708333333333334 | 422.678 |
| 0.7715277777777777 | 418.495 |
| 0.7722222222222223 | 414.364 |
| 0.7729166666666667 | 411.638 |
| 0.7736111111111111 | 407.589 |
| 0.7743055555555555 | 403.587 |
| 0.775 | 398.318 |
| 0.7756944444444445 | 394.415 |
| 0.7763888888888889 | 389.27 |
| 0.7770833333333332 | 386.723 |
| 0.7777777777777778 | 384.191 |
| 0.7784722222222222 | 380.42 |
| 0.7791666666666667 | 374.206 |
| 0.779861111111111 | 369.291 |
| 0.7805555555555556 | 365.635 |
| 0.78125 | 360.798 |
| 0.7819444444444444 | 358.394 |
| 0.782638888888889 | 354.805 |
| 0.7833333333333333 | 351.235 |
| 0.7840277777777778 | 345.322 |
| 0.7847222222222222 | 339.449 |
| 0.7854166666666668 | 333.608 |
| 0.7861111111111111 | 328.955 |
| 0.7868055555555555 | 323.156 |
| 0.7875 | 318.527 |
| 0.7881944444444445 | 312.749 |
| 0.7888888888888889 | 305.819 |
| 0.7895833333333333 | 298.885 |
| 0.7902777777777777 | 293.096 |
| 0.7909722222222223 | 286.13 |
| 0.7916666666666666 | 280.304 |
| 0.7923611111111111 | 274.454 |
| 0.7930555555555556 | 268.576 |
| 0.7937500000000001 | 262.666 |
| 0.7944444444444444 | 256.722 |
| 0.7951388888888888 | 250.739 |
| 0.7958333333333334 | 245.925 |
| 0.7965277777777778 | 239.868 |
| 0.7972222222222222 | 234.99 |
| 0.7979166666666666 | 230.083 |
| 0.7986111111111112 | 223.906 |
| 0.7993055555555556 | 217.681 |
| 0.7999999999999999 | 210.144 |
| 0.8006944444444444 | 202.534 |
| 0.8013888888888889 | 196.135 |
| 0.8020833333333334 | 188.389 |
| 0.8027777777777777 | 180.569 |
| 0.8034722222222223 | 171.353 |
| 0.8041666666666667 | 164.712 |
| 0.8048611111111111 | 155.333 |
| 0.8055555555555555 | 148.579 |
| 0.80625 | 140.417 |
| 0.8069444444444445 | 132.196 |
| 0.8076388888888889 | 122.538 |
| 0.8083333333333332 | 112.814 |
| 0.8090277777777778 | 103.035 |
| 0.8097222222222222 | 94.617 |
| 0.8104166666666667 | 87.583 |
| 0.811111111111111 | 80.536 |
| 0.8118055555555556 | 73.481 |
| 0.8125 | 66.423 |
| 0.8131944444444444 | 60.778 |
| 0.813888888888889 | 55.139 |
| 0.8145833333333333 | 50.914 |
| 0.8152777777777778 | 45.29 |
| 0.8159722222222222 | 41.081 |
| 0.8166666666666668 | 36.881 |
| 0.8173611111111111 | 32.691 |
| 0.8180555555555555 | 28.514 |
| 0.81875 | 25.736 |
| 0.8194444444444445 | 22.965 |
| 0.8201388888888889 | 20.201 |
| 0.8208333333333333 | 17.444 |
| 0.8215277777777777 | 14.696 |
| 0.8222222222222223 | 13.325 |
| 0.8229166666666666 | 10.589 |
| 0.8236111111111111 | 9.225 |
| 0.8243055555555556 | 7.862 |
| 0.8250000000000001 | 6.503 |
| 0.8256944444444444 | 6.503 |
| 0.8263888888888888 | 5.146 |
| 0.8270833333333334 | 3.791 |
| 0.8277777777777778 | 2.439 |
| 0.8284722222222222 | 2.439 |
| 0.8291666666666666 | 1.09 |
| 0.8298611111111112 | 1.09 |
| 0.8305555555555556 | 1.09 |
| 0.8312499999999999 | 1.09 |
| 0.8319444444444444 | -0.256 |
| 0.8326388888888889 | -0.256 |
| 0.8333333333333334 | -0.256 |
| 0.8340277777777777 | -0.256 |
| 0.8347222222222223 | -0.256 |
| 0.8354166666666667 | -0.256 |
| 0.8361111111111111 | -0.256 |
| 0.8368055555555555 | -0.256 |
| 0.8375 | -0.256 |
| 0.8381944444444445 | -0.256 |
| 0.8388888888888889 | -0.256 |
| 0.8395833333333332 | -0.256 |
| 0.8402777777777778 | -0.256 |
| 0.8409722222222222 | -0.256 |
| 0.8416666666666667 | -0.256 |
| 0.842361111111111 | -0.256 |
| 0.8430555555555556 | -0.256 |
| 0.84375 | -0.256 |
| 0.8444444444444444 | -0.256 |
| 0.845138888888889 | -0.256 |
| 0.8458333333333333 | -0.256 |
| 0.8465277777777778 | -0.256 |
| 0.8472222222222222 | -0.256 |
| 0.8479166666666668 | -0.256 |
| 0.8486111111111111 | -0.256 |
| 0.8493055555555555 | -0.256 |
| 0.85 | -0.256 |
| 0.8506944444444445 | -0.256 |
| 0.8513888888888889 | -0.256 |
| 0.8520833333333333 | -0.256 |
| 0.8527777777777777 | -0.256 |
| 0.8534722222222223 | -0.256 |
| 0.8541666666666666 | -0.256 |
| 0.8548611111111111 | -0.256 |
| 0.8555555555555556 | -0.256 |
| 0.8562500000000001 | -0.256 |
| 0.8569444444444444 | -0.256 |
| 0.8576388888888888 | -0.256 |
| 0.8583333333333334 | -0.256 |
| 0.8590277777777778 | -0.256 |
| 0.8597222222222222 | -0.256 |
| 0.8604166666666666 | -0.256 |
| 0.8611111111111112 | -0.256 |
| 0.8618055555555556 | -0.256 |
| 0.8624999999999999 | -0.256 |
| 0.8631944444444444 | -0.256 |
| 0.8638888888888889 | -0.256 |
| 0.8645833333333334 | -0.256 |
| 0.8652777777777777 | -0.256 |
| 0.8659722222222223 | -0.256 |
| 0.8666666666666667 | -0.256 |
| 0.8673611111111111 | -0.256 |
| 0.8680555555555555 | -0.256 |
| 0.86875 | -0.256 |
| 0.8694444444444445 | -0.256 |
| 0.8701388888888889 | -0.256 |
| 0.8708333333333332 | -0.256 |
| 0.8715277777777778 | -0.256 |
| 0.8722222222222222 | -0.256 |
| 0.8729166666666667 | -0.256 |
| 0.873611111111111 | -0.256 |
| 0.8743055555555556 | -0.256 |
| 0.875 | -0.256 |
| 0.8756944444444444 | -0.256 |
| 0.876388888888889 | -0.256 |
| 0.8770833333333333 | -0.256 |
| 0.8777777777777778 | -0.256 |
| 0.8784722222222222 | -0.256 |
| 0.8791666666666668 | -0.256 |
| 0.8798611111111111 | -0.256 |
| 0.8805555555555555 | -0.256 |
| 0.88125 | -0.256 |
| 0.8819444444444445 | -0.256 |
| 0.8826388888888889 | -0.256 |
| 0.8833333333333333 | -0.256 |
| 0.8840277777777777 | -0.256 |
| 0.8847222222222223 | -0.256 |
| 0.8854166666666666 | -0.256 |
| 0.8861111111111111 | -0.256 |
| 0.8868055555555556 | -0.256 |
| 0.8875000000000001 | -0.256 |
| 0.8881944444444444 | -0.256 |
| 0.8888888888888888 | -0.256 |
| 0.8895833333333334 | -0.256 |
| 0.8902777777777778 | -0.256 |
| 0.8909722222222222 | -0.256 |
| 0.8916666666666666 | -0.256 |
| 0.8923611111111112 | -0.256 |
| 0.8930555555555556 | -0.256 |
| 0.8937499999999999 | -0.256 |
| 0.8944444444444444 | -0.256 |
| 0.8951388888888889 | -0.256 |
| 0.8958333333333334 | -0.256 |
| 0.8965277777777777 | -0.256 |
| 0.8972222222222223 | -0.256 |
| 0.8979166666666667 | -0.256 |
| 0.8986111111111111 | -0.256 |
| 0.8993055555555555 | -0.256 |
| 0.9 | -0.256 |
| 0.9006944444444445 | -0.256 |
| 0.9013888888888889 | -0.256 |
| 0.9020833333333332 | -0.256 |
| 0.9027777777777778 | -0.256 |
| 0.9034722222222222 | -0.256 |
| 0.9041666666666667 | -0.256 |
| 0.904861111111111 | -0.256 |
| 0.9055555555555556 | -0.256 |
| 0.90625 | -0.256 |
| 0.9069444444444444 | -0.256 |
| 0.907638888888889 | -0.256 |
| 0.9083333333333333 | -0.256 |
| 0.9090277777777778 | -0.256 |
| 0.9097222222222222 | -0.256 |
| 0.9104166666666668 | -0.256 |
| 0.9111111111111111 | -0.256 |
| 0.9118055555555555 | -0.256 |
| 0.9125 | -0.256 |
| 0.9131944444444445 | -0.256 |
| 0.9138888888888889 | -0.256 |
| 0.9145833333333333 | -0.256 |
| 0.9152777777777777 | -0.256 |
| 0.9159722222222223 | -0.256 |
| 0.9166666666666666 | -0.256 |
| 0.9173611111111111 | -0.256 |
| 0.9180555555555556 | -0.256 |
| 0.9187500000000001 | -0.256 |
| 0.9194444444444444 | -0.256 |
| 0.9201388888888888 | -0.256 |
| 0.9208333333333334 | -0.256 |
| 0.9215277777777778 | -0.256 |
| 0.9222222222222222 | -0.256 |
| 0.9229166666666666 | -0.256 |
| 0.9236111111111112 | -0.256 |
| 0.9243055555555556 | -0.256 |
| 0.9249999999999999 | -0.256 |
| 0.9256944444444444 | -0.256 |
| 0.9263888888888889 | -0.256 |
| 0.9270833333333334 | -0.256 |
| 0.9277777777777777 | -0.256 |
| 0.9284722222222223 | -0.256 |
| 0.9291666666666667 | -0.256 |
| 0.9298611111111111 | -0.256 |
| 0.9305555555555555 | -0.256 |
| 0.93125 | -0.256 |
| 0.9319444444444445 | -0.256 |
| 0.9326388888888889 | -0.256 |
| 0.9333333333333332 | -0.256 |
| 0.9340277777777778 | -0.256 |
| 0.9347222222222222 | -0.256 |
| 0.9354166666666667 | -0.256 |
| 0.936111111111111 | -0.256 |
| 0.9368055555555556 | -0.256 |
| 0.9375 | -0.256 |
| 0.9381944444444444 | -0.256 |
| 0.938888888888889 | -0.256 |
| 0.9395833333333333 | -0.256 |
| 0.9402777777777778 | -0.256 |
| 0.9409722222222222 | -0.256 |
| 0.9416666666666668 | -0.256 |
| 0.9423611111111111 | -0.256 |
| 0.9430555555555555 | -0.256 |
| 0.94375 | -0.256 |
| 0.9444444444444445 | -0.256 |
| 0.9451388888888889 | -0.256 |
| 0.9458333333333333 | -0.256 |
| 0.9465277777777777 | -0.256 |
| 0.9472222222222223 | -0.256 |
| 0.9479166666666666 | -0.256 |
| 0.9486111111111111 | -0.256 |
| 0.9493055555555556 | -0.256 |
| 0.9500000000000001 | -0.256 |
| 0.9506944444444444 | -0.256 |
| 0.9513888888888888 | -0.256 |
| 0.9520833333333334 | -0.256 |
| 0.9527777777777778 | -0.256 |
| 0.9534722222222222 | -0.256 |
| 0.9541666666666666 | -0.256 |
| 0.9548611111111112 | -0.256 |
| 0.9555555555555556 | -0.256 |
| 0.9562499999999999 | -0.256 |
| 0.9569444444444444 | -0.256 |
| 0.9576388888888889 | -0.256 |
| 0.9583333333333334 | -0.256 |
| 0.9590277777777777 | -0.256 |
| 0.9597222222222223 | -0.256 |
| 0.9604166666666667 | -0.256 |
| 0.9611111111111111 | -0.256 |
| 0.9618055555555555 | -0.256 |
| 0.9625 | -0.256 |
| 0.9631944444444445 | -0.256 |
| 0.9638888888888889 | -0.256 |
| 0.9645833333333332 | -0.256 |
| 0.9652777777777778 | -0.256 |
| 0.9659722222222222 | -0.256 |
| 0.9666666666666667 | -0.256 |
| 0.967361111111111 | -0.256 |
| 0.9680555555555556 | -0.256 |
| 0.96875 | -0.256 |
| 0.9694444444444444 | -0.256 |
| 0.970138888888889 | -0.256 |
| 0.9708333333333333 | -0.256 |
| 0.9715277777777778 | -0.256 |
| 0.9722222222222222 | -0.256 |
| 0.9729166666666668 | -0.256 |
| 0.9736111111111111 | -0.256 |
| 0.9743055555555555 | -0.256 |
| 0.975 | -0.256 |
| 0.9756944444444445 | -0.256 |
| 0.9763888888888889 | -0.256 |
| 0.9770833333333333 | -0.256 |
| 0.9777777777777777 | -0.256 |
| 0.9784722222222223 | -0.256 |
| 0.9791666666666666 | -0.256 |
| 0.9798611111111111 | -0.256 |
| 0.9805555555555556 | -0.256 |
| 0.9812500000000001 | -0.256 |
| 0.9819444444444444 | -0.256 |
| 0.9826388888888888 | -0.256 |
| 0.9833333333333334 | -0.256 |
| 0.9840277777777778 | -0.256 |
| 0.9847222222222222 | -0.256 |
| 0.9854166666666666 | -0.256 |
| 0.9861111111111112 | -0.256 |
| 0.9868055555555556 | -0.256 |
| 0.9874999999999999 | -0.256 |
| 0.9881944444444444 | -0.256 |
| 0.9888888888888889 | -0.256 |
| 0.9895833333333334 | -0.256 |
| 0.9902777777777777 | -0.256 |
| 0.9909722222222223 | -0.256 |
| 0.9916666666666667 | -0.256 |
| 0.9923611111111111 | -0.256 |
| 0.9930555555555555 | -0.256 |
| 0.99375 | -0.256 |
| 0.9944444444444445 | -0.256 |
| 0.9951388888888889 | -0.256 |
| 0.9958333333333332 | -0.256 |
| 0.9965277777777778 | -0.256 |
| 0.9972222222222222 | -0.256 |
| 0.9979166666666667 | -0.256 |
| 0.998611111111111 | -0.256 |
| 0.9993055555555556 | 0 |